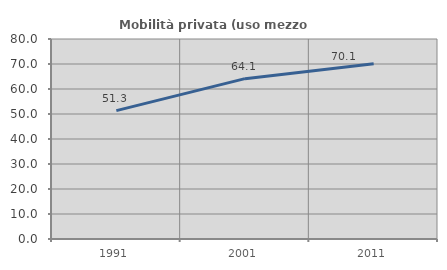
| Category | Mobilità privata (uso mezzo privato) |
|---|---|
| 1991.0 | 51.348 |
| 2001.0 | 64.134 |
| 2011.0 | 70.056 |